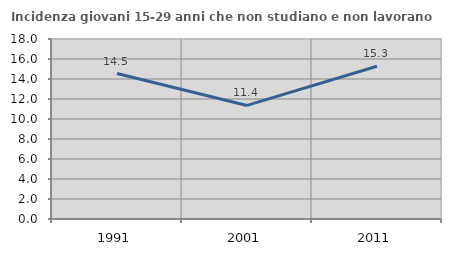
| Category | Incidenza giovani 15-29 anni che non studiano e non lavorano  |
|---|---|
| 1991.0 | 14.543 |
| 2001.0 | 11.357 |
| 2011.0 | 15.28 |